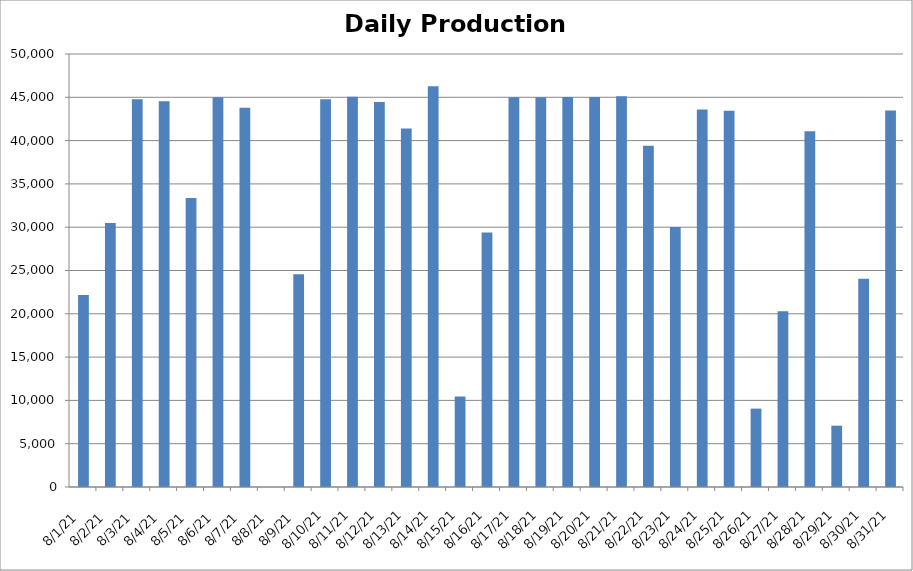
| Category | Cogen Daily Production (kWh) |
|---|---|
| 8/1/21 | 22175.75 |
| 8/2/21 | 30498.25 |
| 8/3/21 | 44782.75 |
| 8/4/21 | 44557.25 |
| 8/5/21 | 33382.5 |
| 8/6/21 | 44998.75 |
| 8/7/21 | 43795 |
| 8/8/21 | 0 |
| 8/9/21 | 24564.5 |
| 8/10/21 | 44766.75 |
| 8/11/21 | 45057.75 |
| 8/12/21 | 44458.5 |
| 8/13/21 | 41397.5 |
| 8/14/21 | 46285.5 |
| 8/15/21 | 10441.5 |
| 8/16/21 | 29381 |
| 8/17/21 | 44995 |
| 8/18/21 | 45012.5 |
| 8/19/21 | 45045.5 |
| 8/20/21 | 45039 |
| 8/21/21 | 45121 |
| 8/22/21 | 39418.75 |
| 8/23/21 | 30024 |
| 8/24/21 | 43591.25 |
| 8/25/21 | 43455 |
| 8/26/21 | 9051.5 |
| 8/27/21 | 20288.5 |
| 8/28/21 | 41069.5 |
| 8/29/21 | 7079.25 |
| 8/30/21 | 24057.75 |
| 8/31/21 | 43464.25 |